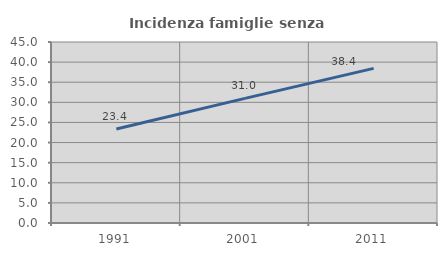
| Category | Incidenza famiglie senza nuclei |
|---|---|
| 1991.0 | 23.352 |
| 2001.0 | 30.978 |
| 2011.0 | 38.434 |